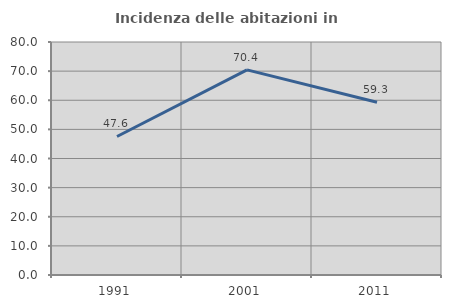
| Category | Incidenza delle abitazioni in proprietà  |
|---|---|
| 1991.0 | 47.561 |
| 2001.0 | 70.443 |
| 2011.0 | 59.292 |